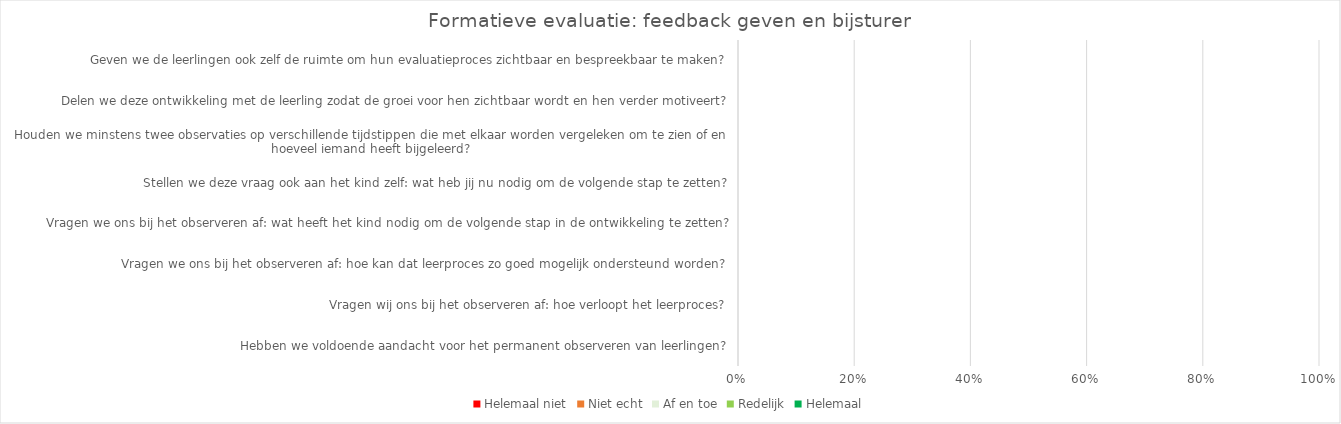
| Category | Helemaal niet | Niet echt | Af en toe | Redelijk | Helemaal |
|---|---|---|---|---|---|
| Hebben we voldoende aandacht voor het permanent observeren van leerlingen? | 0 | 0 | 0 | 0 | 0 |
| Vragen wij ons bij het observeren af: hoe verloopt het leerproces? | 0 | 0 | 0 | 0 | 0 |
| Vragen we ons bij het observeren af: hoe kan dat leerproces zo goed mogelijk ondersteund worden? | 0 | 0 | 0 | 0 | 0 |
| Vragen we ons bij het observeren af: wat heeft het kind nodig om de volgende stap in de ontwikkeling te zetten? | 0 | 0 | 0 | 0 | 0 |
| Stellen we deze vraag ook aan het kind zelf: wat heb jij nu nodig om de volgende stap te zetten? | 0 | 0 | 0 | 0 | 0 |
| Houden we minstens twee observaties op verschillende tijdstippen die met elkaar worden vergeleken om te zien of en hoeveel iemand heeft bijgeleerd? | 0 | 0 | 0 | 0 | 0 |
| Delen we deze ontwikkeling met de leerling zodat de groei voor hen zichtbaar wordt en hen verder motiveert? | 0 | 0 | 0 | 0 | 0 |
| Geven we de leerlingen ook zelf de ruimte om hun evaluatieproces zichtbaar en bespreekbaar te maken? | 0 | 0 | 0 | 0 | 0 |